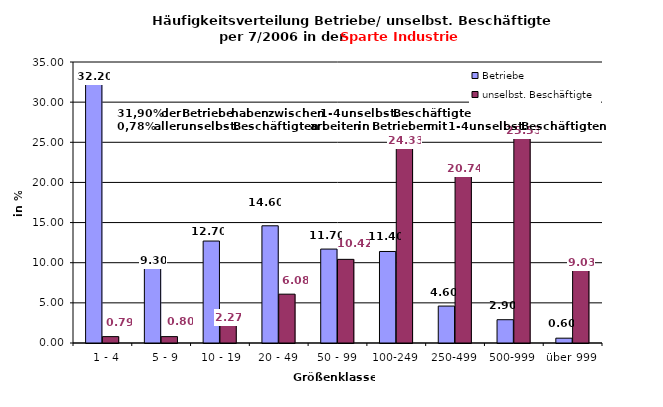
| Category | Betriebe | unselbst. Beschäftigte |
|---|---|---|
|   1 - 4 | 32.2 | 0.794 |
|   5 - 9 | 9.3 | 0.796 |
|  10 - 19 | 12.7 | 2.269 |
| 20 - 49 | 14.6 | 6.082 |
| 50 - 99 | 11.7 | 10.42 |
| 100-249 | 11.4 | 24.334 |
| 250-499 | 4.6 | 20.743 |
| 500-999 | 2.9 | 25.528 |
| über 999 | 0.6 | 9.035 |